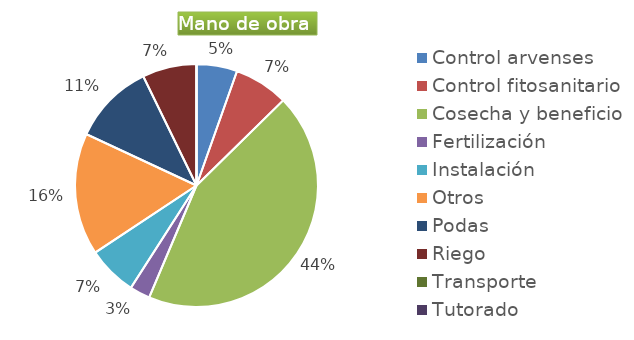
| Category | Series 0 |
|---|---|
| Control arvenses | 4523040 |
| Control fitosanitario | 6030720 |
| Cosecha y beneficio | 36500000 |
| Fertilización | 2261520 |
| Instalación | 5518836 |
| Otros | 13569120 |
| Podas | 9046080 |
| Riego | 6030720 |
| Transporte | 0 |
| Tutorado | 0 |